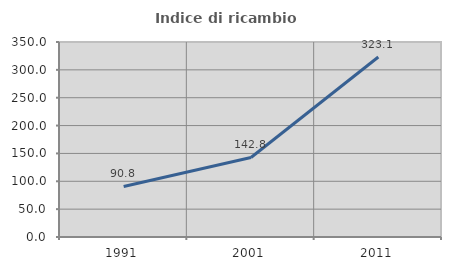
| Category | Indice di ricambio occupazionale  |
|---|---|
| 1991.0 | 90.774 |
| 2001.0 | 142.786 |
| 2011.0 | 323.077 |